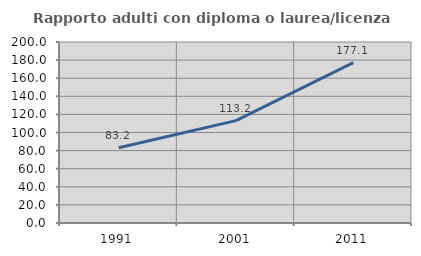
| Category | Rapporto adulti con diploma o laurea/licenza media  |
|---|---|
| 1991.0 | 83.171 |
| 2001.0 | 113.157 |
| 2011.0 | 177.15 |